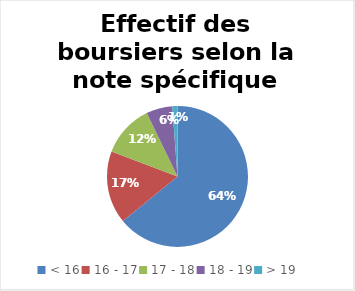
| Category | Effectif des boursiers |
|---|---|
| < 16 | 13235 |
| 16 - 17 | 3436 |
| 17 - 18 | 2492 |
| 18 - 19 | 1239 |
| > 19  | 243 |